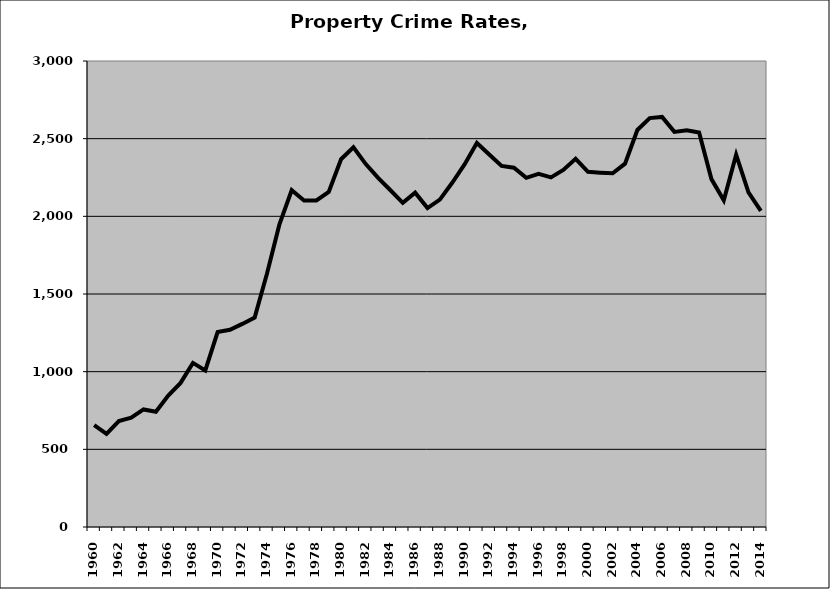
| Category | Property |
|---|---|
| 1960.0 | 656.196 |
| 1961.0 | 599.189 |
| 1962.0 | 682.29 |
| 1963.0 | 703.206 |
| 1964.0 | 756.984 |
| 1965.0 | 741.446 |
| 1966.0 | 846.6 |
| 1967.0 | 927.753 |
| 1968.0 | 1056.454 |
| 1969.0 | 1007.697 |
| 1970.0 | 1254.761 |
| 1971.0 | 1269.463 |
| 1972.0 | 1307.412 |
| 1973.0 | 1347.826 |
| 1974.0 | 1631.993 |
| 1975.0 | 1946.145 |
| 1976.0 | 2168.04 |
| 1977.0 | 2102.367 |
| 1978.0 | 2102.366 |
| 1979.0 | 2157.242 |
| 1980.0 | 2367.895 |
| 1981.0 | 2443.926 |
| 1982.0 | 2336.448 |
| 1983.0 | 2247.226 |
| 1984.0 | 2167.674 |
| 1985.0 | 2086.829 |
| 1986.0 | 2152.215 |
| 1987.0 | 2053.4 |
| 1988.0 | 2107.378 |
| 1989.0 | 2216.155 |
| 1990.0 | 2333.735 |
| 1991.0 | 2472.404 |
| 1992.0 | 2398.179 |
| 1993.0 | 2324.176 |
| 1994.0 | 2312.623 |
| 1995.0 | 2247.976 |
| 1996.0 | 2273.275 |
| 1997.0 | 2250.441 |
| 1998.0 | 2298.564 |
| 1999.0 | 2370.045 |
| 2000.0 | 2286.291 |
| 2001.0 | 2281.264 |
| 2002.0 | 2277.099 |
| 2003.0 | 2339.023 |
| 2004.0 | 2555.85 |
| 2005.0 | 2632.57 |
| 2006.0 | 2639.912 |
| 2007.0 | 2543.604 |
| 2008.0 | 2553.843 |
| 2009.0 | 2539.597 |
| 2010.0 | 2239.619 |
| 2011.0 | 2103.015 |
| 2012.0 | 2396.751 |
| 2013.0 | 2154.138 |
| 2014.0 | 2034.668 |